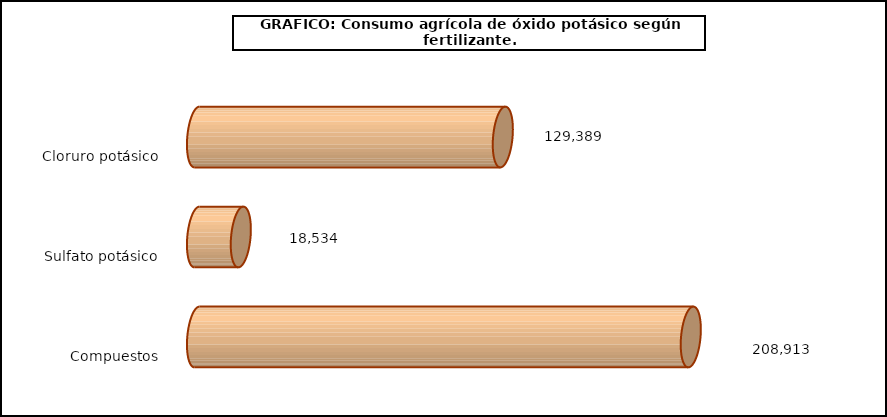
| Category | fert. N |
|---|---|
| 0 | 129389 |
| 1 | 18534 |
| 2 | 208913 |